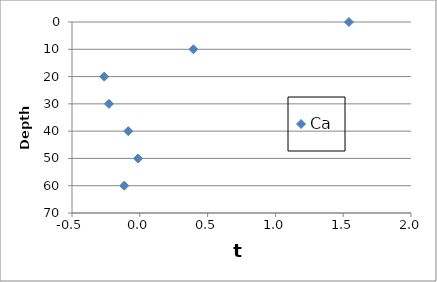
| Category | Ca |
|---|---|
| 1.542451197919064 | 0 |
| 0.395150107034203 | 10 |
| -0.26260649320746 | 20 |
| -0.227813192278132 | 30 |
| -0.0853484386900227 | 40 |
| -0.0127570449352625 | 50 |
| -0.114613031983827 | 60 |